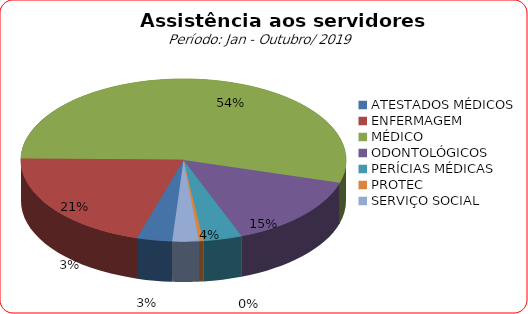
| Category | Series 0 |
|---|---|
| ATESTADOS MÉDICOS | 3.494 |
| ENFERMAGEM | 20.615 |
| MÉDICO | 54.308 |
| ODONTOLÓGICOS | 14.688 |
| PERÍCIAS MÉDICAS | 3.841 |
| PROTEC | 0.421 |
| SERVIÇO SOCIAL | 2.634 |